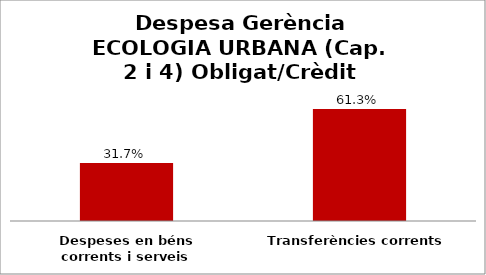
| Category | Series 0 |
|---|---|
| Despeses en béns corrents i serveis | 0.317 |
| Transferències corrents | 0.613 |